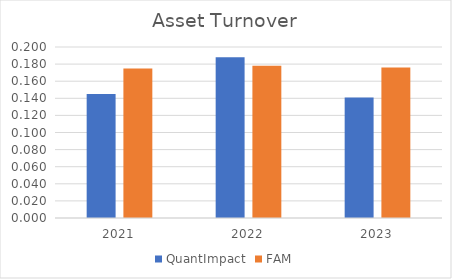
| Category | QuantImpact | FAM |
|---|---|---|
| 2021.0 | 0.145 | 0.175 |
| 2022.0 | 0.188 | 0.178 |
| 2023.0 | 0.141 | 0.176 |